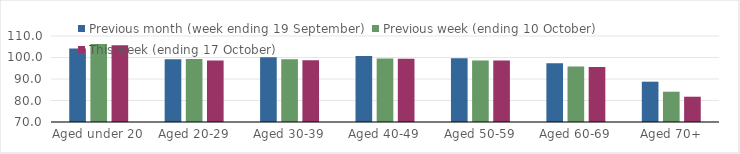
| Category | Previous month (week ending 19 September) | Previous week (ending 10 October) | This week (ending 17 October) |
|---|---|---|---|
| Aged under 20 | 104.24 | 106.31 | 105.67 |
| Aged 20-29 | 99.22 | 99.29 | 98.55 |
| Aged 30-39 | 100.17 | 99.23 | 98.7 |
| Aged 40-49 | 100.72 | 99.53 | 99.43 |
| Aged 50-59 | 99.69 | 98.64 | 98.55 |
| Aged 60-69 | 97.28 | 95.84 | 95.58 |
| Aged 70+ | 88.75 | 84.08 | 81.76 |